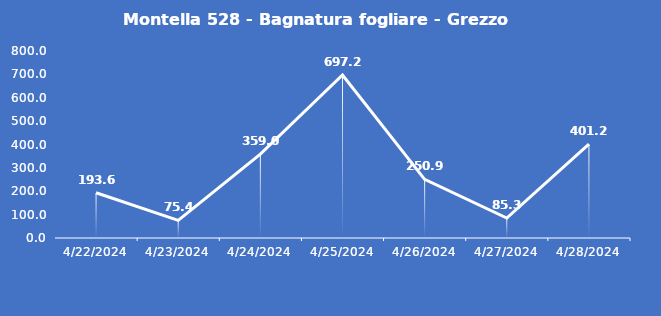
| Category | Montella 528 - Bagnatura fogliare - Grezzo (min) |
|---|---|
| 4/22/24 | 193.6 |
| 4/23/24 | 75.4 |
| 4/24/24 | 359 |
| 4/25/24 | 697.2 |
| 4/26/24 | 250.9 |
| 4/27/24 | 85.3 |
| 4/28/24 | 401.2 |